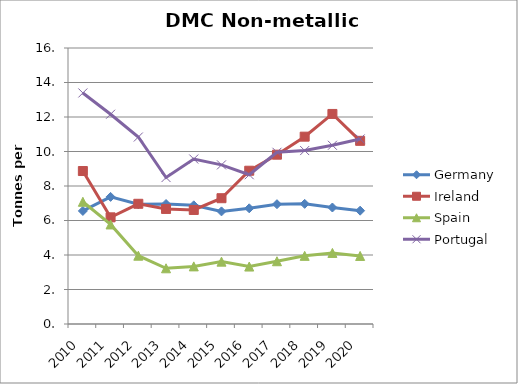
| Category | Germany  | Ireland | Spain | Portugal |
|---|---|---|---|---|
| 2010 | 6.554 | 8.868 | 7.085 | 13.394 |
| 2011 | 7.368 | 6.183 | 5.771 | 12.161 |
| 2012 | 6.94 | 6.969 | 3.959 | 10.839 |
| 2013 | 6.956 | 6.67 | 3.23 | 8.49 |
| 2014 | 6.88 | 6.611 | 3.34 | 9.564 |
| 2015 | 6.528 | 7.292 | 3.615 | 9.224 |
| 2016 | 6.707 | 8.885 | 3.33 | 8.653 |
| 2017 | 6.945 | 9.815 | 3.638 | 9.955 |
| 2018 | 6.965 | 10.86 | 3.951 | 10.054 |
| 2019 | 6.753 | 12.177 | 4.12 | 10.36 |
| 2020 | 6.569 | 10.618 | 3.945 | 10.727 |